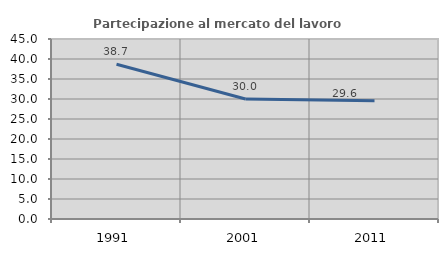
| Category | Partecipazione al mercato del lavoro  femminile |
|---|---|
| 1991.0 | 38.678 |
| 2001.0 | 30 |
| 2011.0 | 29.564 |